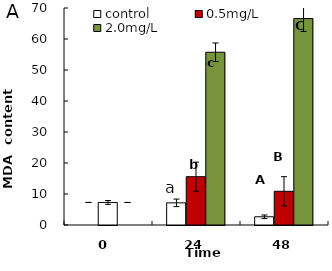
| Category | control | 0.5mg/L | 2.0mg/L |
|---|---|---|---|
| 0.0 | 7.277 | 7.277 | 7.277 |
| 24.0 | 7.147 | 15.578 | 55.722 |
| 48.0 | 2.649 | 10.868 | 66.601 |